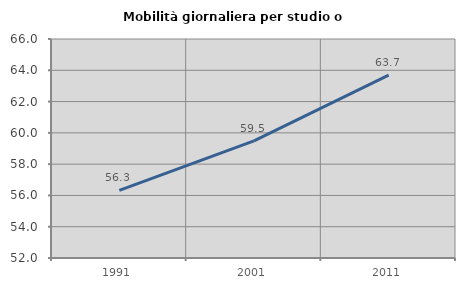
| Category | Mobilità giornaliera per studio o lavoro |
|---|---|
| 1991.0 | 56.317 |
| 2001.0 | 59.493 |
| 2011.0 | 63.693 |